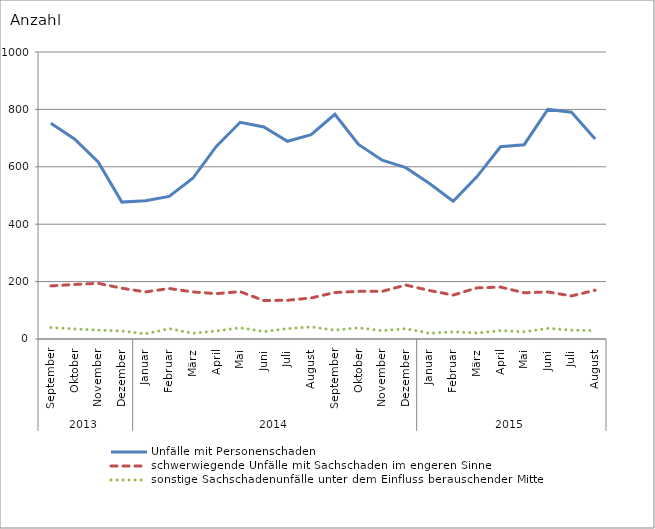
| Category | Unfälle mit Personenschaden | schwerwiegende Unfälle mit Sachschaden im engeren Sinne | sonstige Sachschadenunfälle unter dem Einfluss berauschender Mittel |
|---|---|---|---|
| 0 | 752 | 185 | 40 |
| 1 | 697 | 190 | 35 |
| 2 | 617 | 194 | 31 |
| 3 | 477 | 177 | 28 |
| 4 | 482 | 164 | 18 |
| 5 | 497 | 176 | 36 |
| 6 | 560 | 164 | 20 |
| 7 | 672 | 158 | 28 |
| 8 | 755 | 165 | 39 |
| 9 | 739 | 134 | 26 |
| 10 | 689 | 135 | 36 |
| 11 | 712 | 143 | 42 |
| 12 | 783 | 162 | 31 |
| 13 | 678 | 166 | 39 |
| 14 | 623 | 166 | 29 |
| 15 | 597 | 188 | 36 |
| 16 | 542 | 169 | 20 |
| 17 | 480 | 153 | 25 |
| 18 | 565 | 178 | 21 |
| 19 | 670 | 181 | 29 |
| 20 | 677 | 161 | 25 |
| 21 | 800 | 164 | 37 |
| 22 | 790 | 150 | 31 |
| 23 | 697 | 170 | 29 |